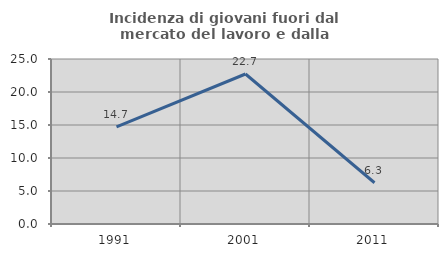
| Category | Incidenza di giovani fuori dal mercato del lavoro e dalla formazione  |
|---|---|
| 1991.0 | 14.706 |
| 2001.0 | 22.727 |
| 2011.0 | 6.25 |